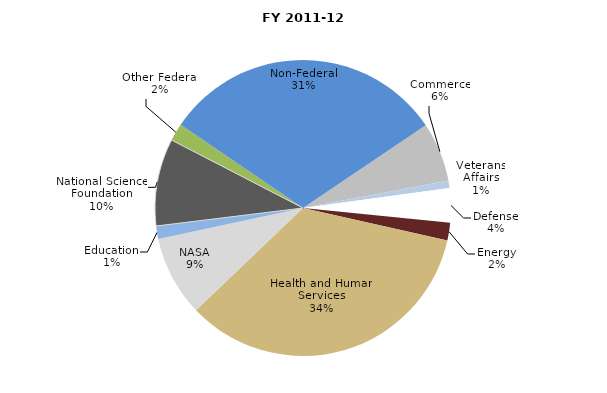
| Category | Series 0 |
|---|---|
| Commerce | 52962120 |
| Veterans Affairs | 6881617 |
| Defense | 30704244 |
| Energy | 15871103 |
| Health and Human Services | 281418018 |
| NASA | 71994708 |
| Education | 11577897 |
| National Science Foundation | 78165735 |
| Other Federal | 15751069 |
| Non-Federal | 254500234.62 |